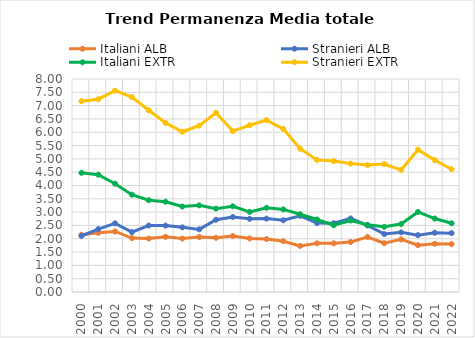
| Category | Italiani ALB | Stranieri ALB | Italiani EXTR | Stranieri EXTR |
|---|---|---|---|---|
| 2000.0 | 2.149 | 2.103 | 4.475 | 7.165 |
| 2001.0 | 2.223 | 2.362 | 4.407 | 7.242 |
| 2002.0 | 2.274 | 2.579 | 4.066 | 7.562 |
| 2003.0 | 2.027 | 2.248 | 3.656 | 7.321 |
| 2004.0 | 2.008 | 2.498 | 3.448 | 6.825 |
| 2005.0 | 2.071 | 2.494 | 3.39 | 6.349 |
| 2006.0 | 2.007 | 2.429 | 3.209 | 6.019 |
| 2007.0 | 2.064 | 2.352 | 3.256 | 6.25 |
| 2008.0 | 2.035 | 2.715 | 3.131 | 6.73 |
| 2009.0 | 2.102 | 2.819 | 3.221 | 6.042 |
| 2010.0 | 2.013 | 2.749 | 3.01 | 6.262 |
| 2011.0 | 1.989 | 2.756 | 3.163 | 6.455 |
| 2012.0 | 1.908 | 2.693 | 3.101 | 6.123 |
| 2013.0 | 1.732 | 2.86 | 2.921 | 5.381 |
| 2014.0 | 1.828 | 2.588 | 2.723 | 4.962 |
| 2015.0 | 1.828 | 2.585 | 2.507 | 4.919 |
| 2016.0 | 1.878 | 2.763 | 2.685 | 4.823 |
| 2017.0 | 2.067 | 2.499 | 2.523 | 4.767 |
| 2018.0 | 1.834 | 2.176 | 2.449 | 4.805 |
| 2019.0 | 1.978 | 2.239 | 2.553 | 4.586 |
| 2020.0 | 1.76 | 2.136 | 3.007 | 5.342 |
| 2021.0 | 1.811 | 2.225 | 2.758 | 4.954 |
| 2022.0 | 1.799 | 2.209 | 2.581 | 4.61 |